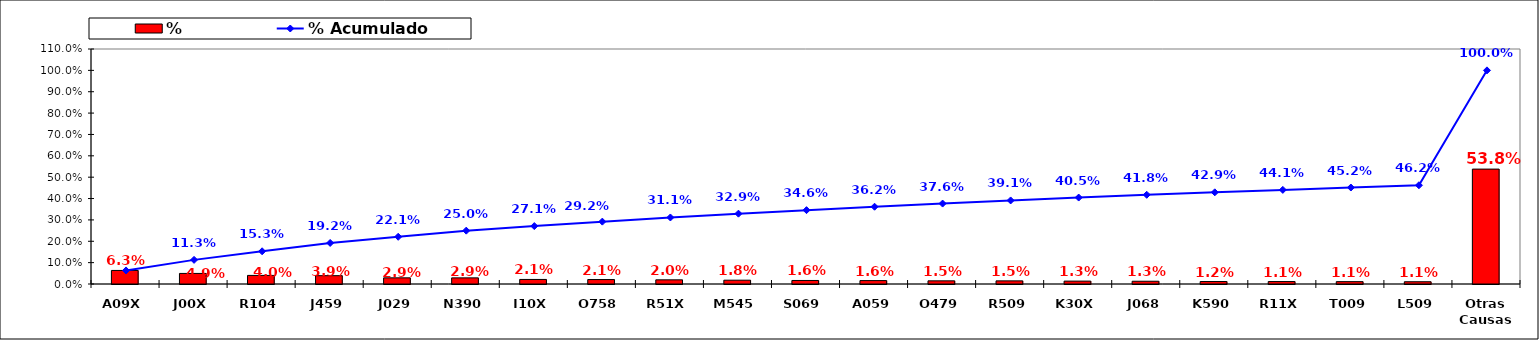
| Category | % |
|---|---|
| A09X | 0.063 |
| J00X | 0.049 |
| R104 | 0.04 |
| J459 | 0.039 |
| J029 | 0.029 |
| N390 | 0.029 |
| I10X | 0.021 |
| O758 | 0.021 |
| R51X | 0.02 |
| M545 | 0.018 |
| S069 | 0.016 |
| A059 | 0.016 |
| O479 | 0.015 |
| R509 | 0.015 |
| K30X | 0.013 |
| J068 | 0.013 |
| K590 | 0.012 |
| R11X | 0.011 |
| T009 | 0.011 |
| L509 | 0.011 |
| Otras Causas | 0.538 |